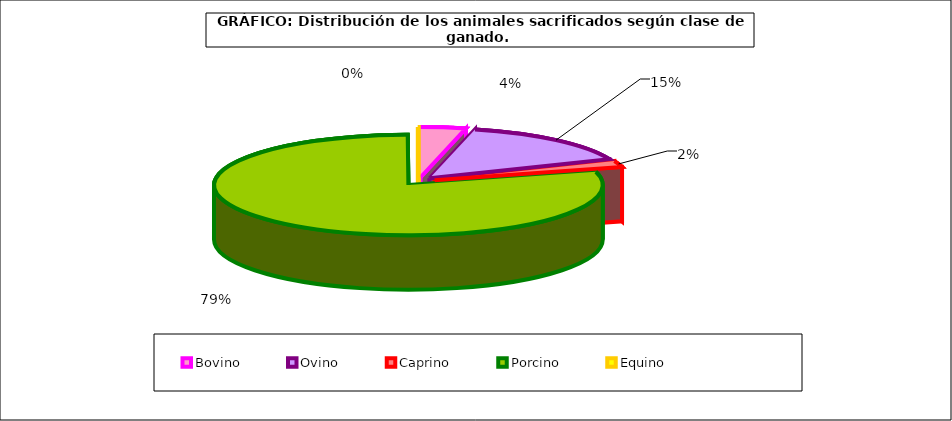
| Category | Series 0 |
|---|---|
| 0 | 2510774 |
| 1 | 10060045 |
| 2 | 1303400 |
| 3 | 52982314 |
| 4 | 37211 |